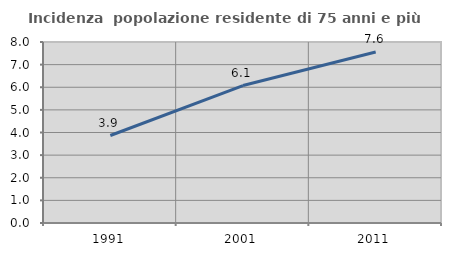
| Category | Incidenza  popolazione residente di 75 anni e più |
|---|---|
| 1991.0 | 3.866 |
| 2001.0 | 6.074 |
| 2011.0 | 7.557 |